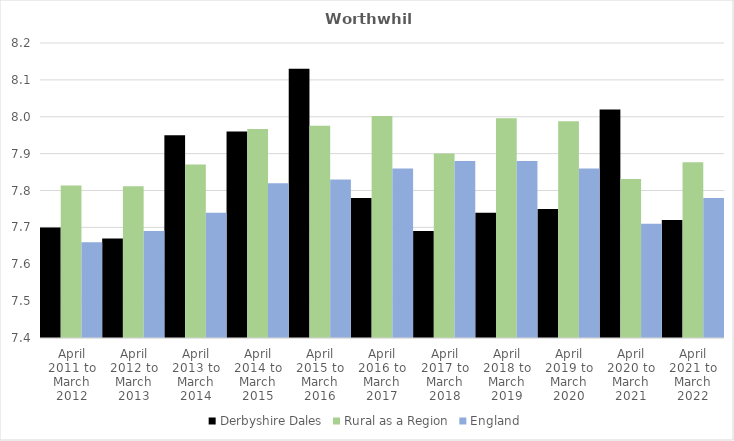
| Category | Derbyshire Dales | Rural as a Region | England |
|---|---|---|---|
| April 2011 to March 2012 | 7.7 | 7.813 | 7.66 |
| April 2012 to March 2013 | 7.67 | 7.811 | 7.69 |
| April 2013 to March 2014 | 7.95 | 7.871 | 7.74 |
| April 2014 to March 2015 | 7.96 | 7.967 | 7.82 |
| April 2015 to March 2016 | 8.13 | 7.975 | 7.83 |
| April 2016 to March 2017 | 7.78 | 8.002 | 7.86 |
| April 2017 to March 2018 | 7.69 | 7.9 | 7.88 |
| April 2018 to March 2019 | 7.74 | 7.996 | 7.88 |
| April 2019 to March 2020 | 7.75 | 7.988 | 7.86 |
| April 2020 to March 2021 | 8.02 | 7.831 | 7.71 |
| April 2021 to March 2022 | 7.72 | 7.877 | 7.78 |